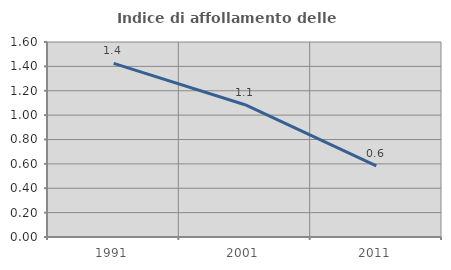
| Category | Indice di affollamento delle abitazioni  |
|---|---|
| 1991.0 | 1.424 |
| 2001.0 | 1.085 |
| 2011.0 | 0.583 |